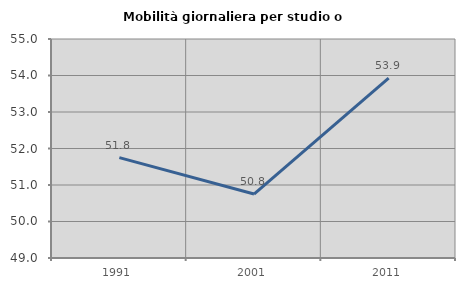
| Category | Mobilità giornaliera per studio o lavoro |
|---|---|
| 1991.0 | 51.75 |
| 2001.0 | 50.752 |
| 2011.0 | 53.929 |